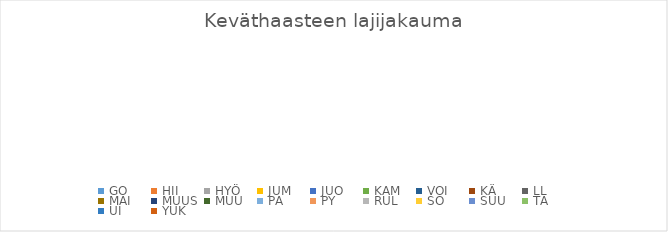
| Category | GO |
|---|---|
| GO | 0 |
| HII | 0 |
| HYÖ | 0 |
| JUM | 0 |
| JUO | 0 |
| KAM | 0 |
| VOI | 0 |
| KÄ | 0 |
| LL | 0 |
| MAI | 0 |
| MUUS | 0 |
| MUU | 0 |
| PA | 0 |
| PY | 0 |
| RUL | 0 |
| SO | 0 |
| SUU | 0 |
| TA | 0 |
| UI | 0 |
| YUK | 0 |